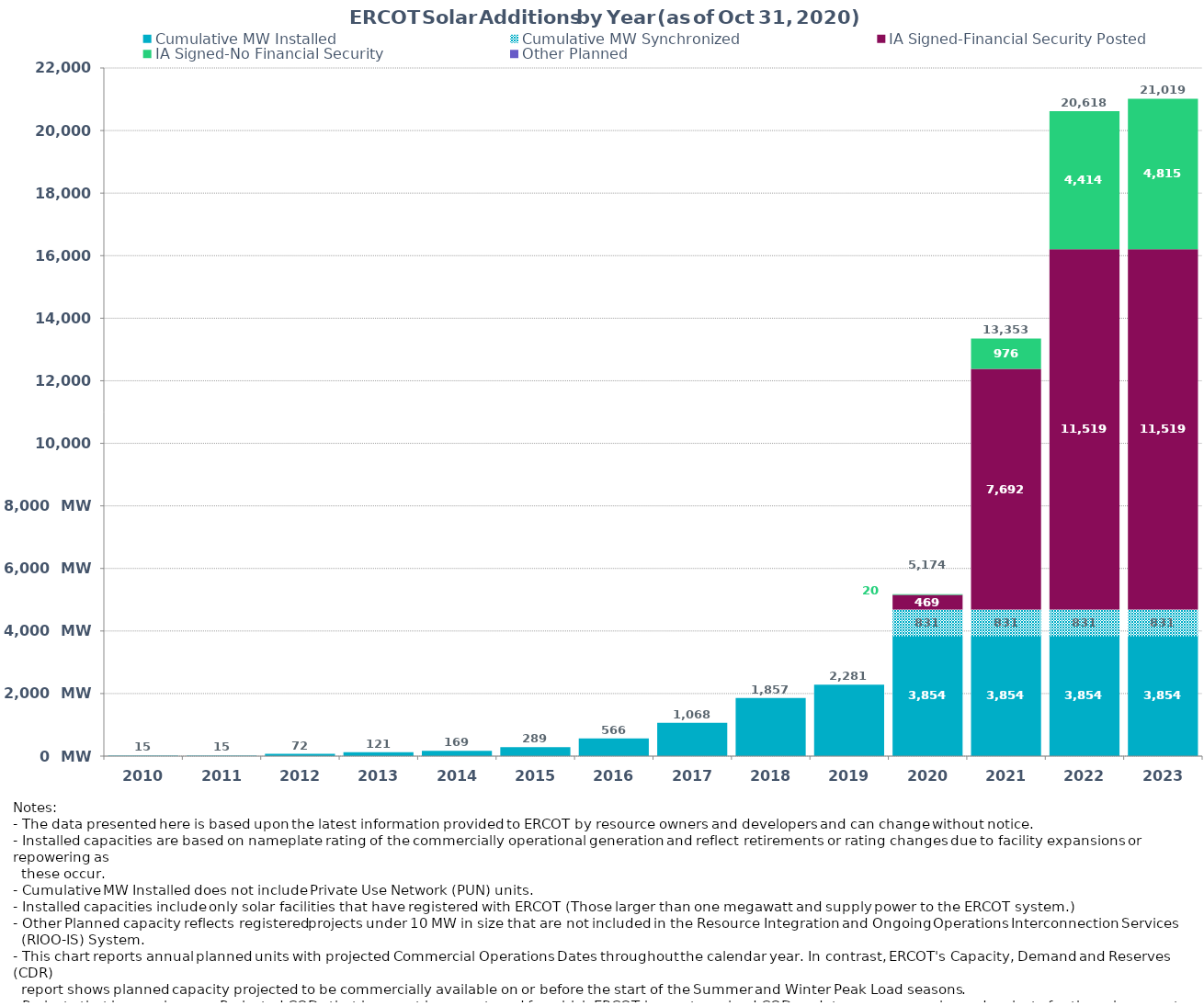
| Category | Cumulative MW Installed | Cumulative MW Synchronized | IA Signed-Financial Security Posted  | IA Signed-No Financial Security  | Other Planned | Cumulative Installed and Planned |
|---|---|---|---|---|---|---|
| 2010.0 | 15 | 0 | 0 | 0 | 0 | 15 |
| 2011.0 | 15 | 0 | 0 | 0 | 0 | 15 |
| 2012.0 | 72.3 | 0 | 0 | 0 | 0 | 72.3 |
| 2013.0 | 121.2 | 0 | 0 | 0 | 0 | 121.2 |
| 2014.0 | 168.7 | 0 | 0 | 0 | 0 | 168.7 |
| 2015.0 | 289.28 | 0 | 0 | 0 | 0 | 289.28 |
| 2016.0 | 565.78 | 0 | 0 | 0 | 0 | 565.78 |
| 2017.0 | 1067.78 | 0 | 0 | 0 | 0 | 1067.78 |
| 2018.0 | 1856.78 | 0 | 0 | 0 | 0 | 1856.78 |
| 2019.0 | 2281.38 | 0 | 0 | 0 | 0 | 2281.38 |
| 2020.0 | 3853.91 | 831 | 468.73 | 20 | 0 | 5173.64 |
| 2021.0 | 3853.91 | 831 | 7692 | 975.59 | 0 | 13352.5 |
| 2022.0 | 3853.91 | 831 | 11519.2 | 4413.58 | 0 | 20617.69 |
| 2023.0 | 3853.91 | 831 | 11519.2 | 4814.58 | 0 | 21018.69 |